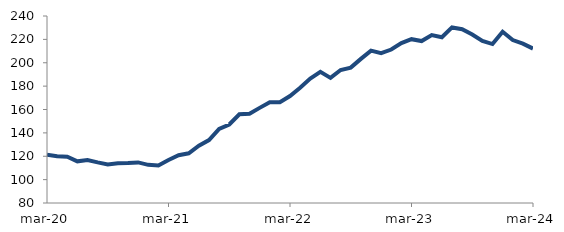
| Category | Series 0 |
|---|---|
| 2020-03-01 | 121.406 |
| 2020-04-01 | 120.076 |
| 2020-05-01 | 119.592 |
| 2020-06-01 | 115.658 |
| 2020-07-01 | 116.729 |
| 2020-08-01 | 114.728 |
| 2020-09-01 | 113.012 |
| 2020-10-01 | 114.05 |
| 2020-11-01 | 114.24 |
| 2020-12-01 | 114.741 |
| 2021-01-01 | 112.625 |
| 2021-02-01 | 112.14 |
| 2021-03-01 | 116.74 |
| 2021-04-01 | 120.911 |
| 2021-05-01 | 122.536 |
| 2021-06-01 | 128.968 |
| 2021-07-01 | 133.864 |
| 2021-08-01 | 143.384 |
| 2021-09-01 | 147.196 |
| 2021-10-01 | 155.883 |
| 2021-11-01 | 156.426 |
| 2021-12-01 | 161.4 |
| 2022-01-01 | 166.276 |
| 2022-02-01 | 166.219 |
| 2022-03-01 | 171.531 |
| 2022-04-01 | 178.644 |
| 2022-05-01 | 186.465 |
| 2022-06-01 | 192.187 |
| 2022-07-01 | 187.044 |
| 2022-08-01 | 193.806 |
| 2022-09-01 | 195.846 |
| 2022-10-01 | 203.287 |
| 2022-11-01 | 210.344 |
| 2022-12-01 | 208.16 |
| 2023-01-01 | 211.29 |
| 2023-02-01 | 216.772 |
| 2023-03-01 | 220.156 |
| 2023-04-01 | 218.537 |
| 2023-05-01 | 223.702 |
| 2023-06-01 | 221.798 |
| 2023-07-01 | 230.236 |
| 2023-08-01 | 228.637 |
| 2023-09-01 | 224.175 |
| 2023-10-01 | 218.647 |
| 2023-11-01 | 215.985 |
| 2023-12-01 | 226.505 |
| 2024-01-01 | 219.392 |
| 2024-02-01 | 216.347 |
| 2024-03-01 | 212.111 |